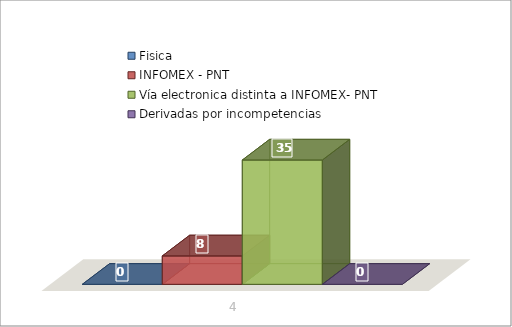
| Category | Fisica | INFOMEX - PNT | Vía electronica distinta a INFOMEX- PNT | Derivadas por incompetencias |
|---|---|---|---|---|
| 0 | 0 | 8 | 35 | 0 |